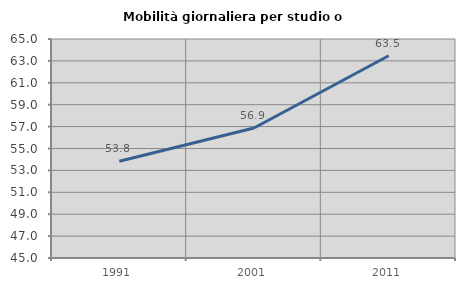
| Category | Mobilità giornaliera per studio o lavoro |
|---|---|
| 1991.0 | 53.828 |
| 2001.0 | 56.875 |
| 2011.0 | 63.466 |